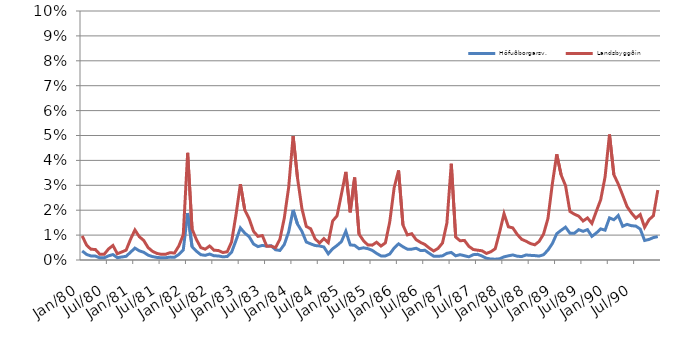
| Category | Höfuðborgarsv. | Landsbyggðin |
|---|---|---|
| 1980-01-01 | 0.363 | 0.967 |
| 1980-02-01 | 0.223 | 0.597 |
| 1980-03-01 | 0.161 | 0.431 |
| 1980-04-01 | 0.158 | 0.423 |
| 1980-05-01 | 0.087 | 0.232 |
| 1980-06-01 | 0.086 | 0.229 |
| 1980-07-01 | 0.167 | 0.446 |
| 1980-08-01 | 0.218 | 0.583 |
| 1980-09-01 | 0.094 | 0.251 |
| 1980-10-01 | 0.12 | 0.322 |
| 1980-11-01 | 0.148 | 0.396 |
| 1980-12-01 | 0.312 | 0.833 |
| 1981-01-01 | 0.476 | 1.206 |
| 1981-02-01 | 0.369 | 0.935 |
| 1981-03-01 | 0.31 | 0.786 |
| 1981-04-01 | 0.196 | 0.497 |
| 1981-05-01 | 0.137 | 0.349 |
| 1981-06-01 | 0.104 | 0.265 |
| 1981-07-01 | 0.09 | 0.228 |
| 1981-08-01 | 0.091 | 0.233 |
| 1981-09-01 | 0.116 | 0.295 |
| 1981-10-01 | 0.11 | 0.279 |
| 1981-11-01 | 0.222 | 0.564 |
| 1981-12-01 | 0.399 | 1.011 |
| 1982-01-01 | 1.885 | 4.304 |
| 1982-02-01 | 0.536 | 1.245 |
| 1982-03-01 | 0.351 | 0.819 |
| 1982-04-01 | 0.213 | 0.497 |
| 1982-05-01 | 0.186 | 0.435 |
| 1982-06-01 | 0.241 | 0.562 |
| 1982-07-01 | 0.169 | 0.394 |
| 1982-08-01 | 0.163 | 0.381 |
| 1982-09-01 | 0.129 | 0.301 |
| 1982-10-01 | 0.141 | 0.329 |
| 1982-11-01 | 0.312 | 0.727 |
| 1982-12-01 | 0.783 | 1.814 |
| 1983-01-01 | 1.287 | 3.048 |
| 1983-02-01 | 1.08 | 2.007 |
| 1983-03-01 | 0.935 | 1.655 |
| 1983-04-01 | 0.642 | 1.15 |
| 1983-05-01 | 0.538 | 0.948 |
| 1983-06-01 | 0.586 | 0.981 |
| 1983-07-01 | 0.559 | 0.554 |
| 1983-08-01 | 0.574 | 0.555 |
| 1983-09-01 | 0.411 | 0.494 |
| 1983-10-01 | 0.383 | 0.835 |
| 1983-11-01 | 0.623 | 1.689 |
| 1983-12-01 | 1.135 | 2.931 |
| 1984-01-01 | 2.011 | 4.979 |
| 1984-02-01 | 1.442 | 3.298 |
| 1984-03-01 | 1.153 | 2.07 |
| 1984-04-01 | 0.722 | 1.348 |
| 1984-05-01 | 0.648 | 1.253 |
| 1984-06-01 | 0.581 | 0.852 |
| 1984-07-01 | 0.565 | 0.683 |
| 1984-08-01 | 0.522 | 0.86 |
| 1984-09-01 | 0.25 | 0.696 |
| 1984-10-01 | 0.451 | 1.565 |
| 1984-11-01 | 0.584 | 1.775 |
| 1984-12-01 | 0.738 | 2.647 |
| 1985-01-01 | 1.157 | 3.536 |
| 1985-02-01 | 0.606 | 1.915 |
| 1985-03-01 | 0.588 | 3.313 |
| 1985-04-01 | 0.453 | 1.041 |
| 1985-05-01 | 0.489 | 0.78 |
| 1985-06-01 | 0.457 | 0.606 |
| 1985-07-01 | 0.388 | 0.597 |
| 1985-08-01 | 0.265 | 0.712 |
| 1985-09-01 | 0.165 | 0.561 |
| 1985-10-01 | 0.164 | 0.687 |
| 1985-11-01 | 0.24 | 1.537 |
| 1985-12-01 | 0.481 | 2.906 |
| 1986-01-01 | 0.649 | 3.596 |
| 1986-02-01 | 0.531 | 1.405 |
| 1986-03-01 | 0.435 | 1.008 |
| 1986-04-01 | 0.435 | 1.056 |
| 1986-05-01 | 0.472 | 0.816 |
| 1986-06-01 | 0.38 | 0.706 |
| 1986-07-01 | 0.389 | 0.621 |
| 1986-08-01 | 0.267 | 0.478 |
| 1986-09-01 | 0.152 | 0.361 |
| 1986-10-01 | 0.148 | 0.468 |
| 1986-11-01 | 0.167 | 0.684 |
| 1986-12-01 | 0.269 | 1.485 |
| 1987-01-01 | 0.303 | 3.864 |
| 1987-02-01 | 0.168 | 0.922 |
| 1987-03-01 | 0.214 | 0.773 |
| 1987-04-01 | 0.171 | 0.786 |
| 1987-05-01 | 0.128 | 0.549 |
| 1987-06-01 | 0.215 | 0.422 |
| 1987-07-01 | 0.227 | 0.394 |
| 1987-08-01 | 0.159 | 0.37 |
| 1987-09-01 | 0.07 | 0.264 |
| 1987-10-01 | 0.039 | 0.331 |
| 1987-11-01 | 0.033 | 0.452 |
| 1987-12-01 | 0.049 | 1.119 |
| 1988-01-01 | 0.127 | 1.86 |
| 1988-02-01 | 0.167 | 1.333 |
| 1988-03-01 | 0.203 | 1.29 |
| 1988-04-01 | 0.153 | 1.028 |
| 1988-05-01 | 0.137 | 0.834 |
| 1988-06-01 | 0.201 | 0.755 |
| 1988-07-01 | 0.187 | 0.661 |
| 1988-08-01 | 0.177 | 0.61 |
| 1988-09-01 | 0.158 | 0.747 |
| 1988-10-01 | 0.212 | 1.044 |
| 1988-11-01 | 0.399 | 1.668 |
| 1988-12-01 | 0.66 | 3.06 |
| 1989-01-01 | 1.056 | 4.246 |
| 1989-02-01 | 1.193 | 3.415 |
| 1989-03-01 | 1.318 | 2.986 |
| 1989-04-01 | 1.078 | 1.95 |
| 1989-05-01 | 1.072 | 1.84 |
| 1989-06-01 | 1.218 | 1.761 |
| 1989-07-01 | 1.151 | 1.567 |
| 1989-08-01 | 1.22 | 1.689 |
| 1989-09-01 | 0.95 | 1.47 |
| 1989-10-01 | 1.083 | 1.952 |
| 1989-11-01 | 1.249 | 2.418 |
| 1989-12-01 | 1.198 | 3.337 |
| 1990-01-01 | 1.691 | 5.04 |
| 1990-02-01 | 1.617 | 3.425 |
| 1990-03-01 | 1.787 | 3.051 |
| 1990-04-01 | 1.354 | 2.606 |
| 1990-05-01 | 1.431 | 2.145 |
| 1990-06-01 | 1.377 | 1.889 |
| 1990-07-01 | 1.362 | 1.68 |
| 1990-08-01 | 1.245 | 1.824 |
| 1990-09-01 | 0.784 | 1.316 |
| 1990-10-01 | 0.826 | 1.618 |
| 1990-11-01 | 0.901 | 1.777 |
| 1990-12-01 | 0.94 | 2.809 |